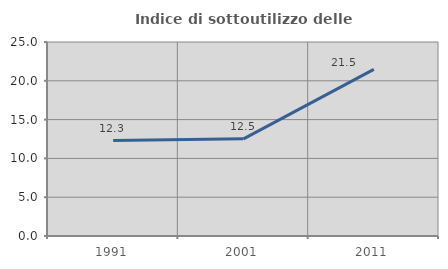
| Category | Indice di sottoutilizzo delle abitazioni  |
|---|---|
| 1991.0 | 12.295 |
| 2001.0 | 12.521 |
| 2011.0 | 21.481 |